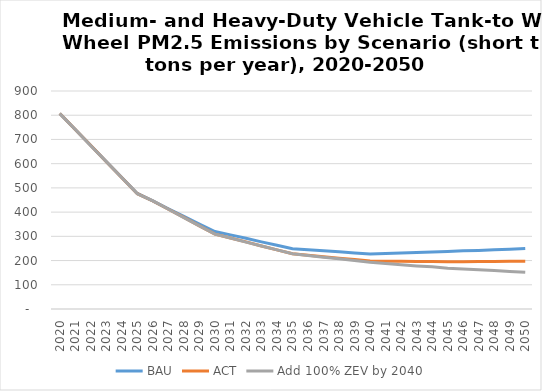
| Category | BAU | ACT | Add 100% ZEV by 2040 |
|---|---|---|---|
| 2020.0 | 807 | 807 | 806.776 |
| 2021.0 | 741 | 741 | 741 |
| 2022.0 | 675 | 675 | 674 |
| 2023.0 | 609 | 608 | 608 |
| 2024.0 | 543 | 542 | 542 |
| 2025.0 | 477 | 476 | 475.622 |
| 2026.0 | 446 | 446 | 446 |
| 2027.0 | 414 | 412 | 412 |
| 2028.0 | 383 | 378 | 377 |
| 2029.0 | 351 | 343 | 343 |
| 2030.0 | 320 | 309 | 308.822 |
| 2031.0 | 306 | 293 | 293 |
| 2032.0 | 292 | 277 | 276 |
| 2033.0 | 277 | 260 | 260 |
| 2034.0 | 263 | 244 | 244 |
| 2035.0 | 249 | 228 | 227.872 |
| 2036.0 | 245 | 222 | 221 |
| 2037.0 | 240 | 216 | 214 |
| 2038.0 | 236 | 210 | 207 |
| 2039.0 | 231 | 204 | 200 |
| 2040.0 | 227 | 198 | 192.873 |
| 2041.0 | 229 | 197 | 188 |
| 2042.0 | 231 | 197 | 183 |
| 2043.0 | 233 | 196 | 178 |
| 2044.0 | 235 | 196 | 174 |
| 2045.0 | 237 | 195 | 168.73 |
| 2046.0 | 240 | 195 | 165 |
| 2047.0 | 242 | 196 | 162 |
| 2048.0 | 245 | 196 | 159 |
| 2049.0 | 247 | 197 | 155 |
| 2050.0 | 250 | 197 | 151.79 |